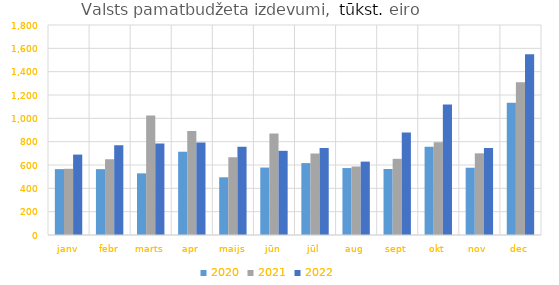
| Category | 2020 | 2021 | 2022 |
|---|---|---|---|
| janv | 564731.731 | 567519.181 | 689237.965 |
| febr | 564358.73 | 649337.389 | 769410.975 |
| marts | 528520.586 | 1024865.74 | 784728.56 |
| apr | 713875.034 | 890597.122 | 792151.693 |
| maijs | 494549.632 | 666390.632 | 756370.204 |
| jūn | 578082.287 | 868998.418 | 721608.297 |
| jūl | 616330.617 | 698429.777 | 745948.556 |
| aug | 573848.626 | 587185.295 | 628998.795 |
| sept | 565735.173 | 652999.82 | 879428.128 |
| okt | 755917.602 | 795708.656 | 1117520.592 |
| nov | 576740.78 | 700002.359 | 745480.917 |
| dec | 1134353.728 | 1308324.606 | 1550280.295 |